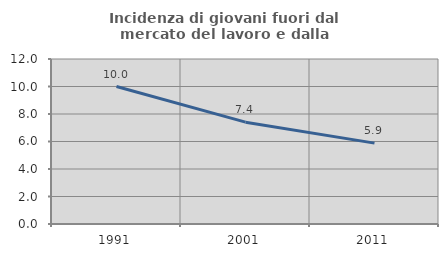
| Category | Incidenza di giovani fuori dal mercato del lavoro e dalla formazione  |
|---|---|
| 1991.0 | 10 |
| 2001.0 | 7.407 |
| 2011.0 | 5.882 |